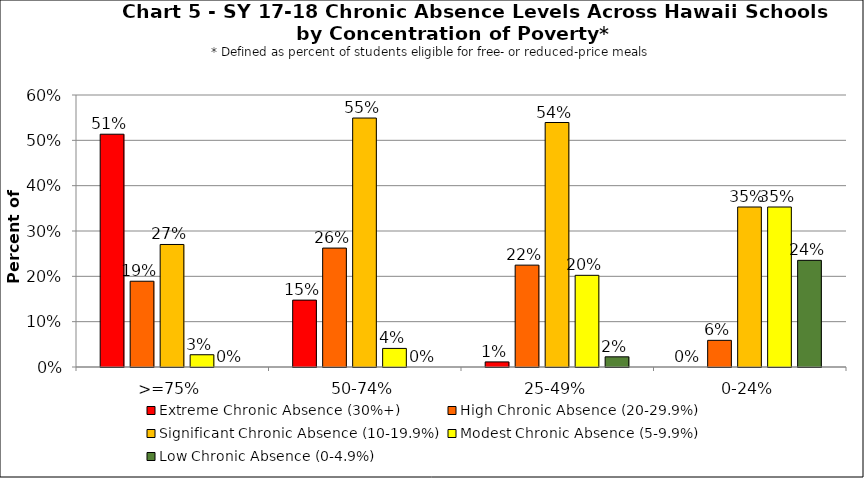
| Category | Extreme Chronic Absence (30%+) | High Chronic Absence (20-29.9%) | Significant Chronic Absence (10-19.9%) | Modest Chronic Absence (5-9.9%) | Low Chronic Absence (0-4.9%) |
|---|---|---|---|---|---|
| 0 | 0.514 | 0.189 | 0.27 | 0.027 | 0 |
| 1 | 0.148 | 0.262 | 0.549 | 0.041 | 0 |
| 2 | 0.011 | 0.225 | 0.539 | 0.202 | 0.022 |
| 3 | 0 | 0.059 | 0.353 | 0.353 | 0.235 |